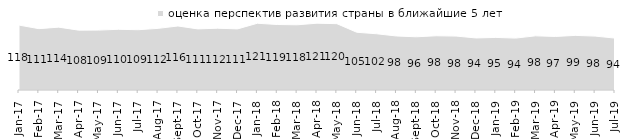
| Category | оценка перспектив развития страны в ближайшие 5 лет |
|---|---|
| 2017-01-01 | 117.55 |
| 2017-02-01 | 111.15 |
| 2017-03-01 | 113.85 |
| 2017-04-01 | 108.45 |
| 2017-05-01 | 108.5 |
| 2017-06-01 | 109.95 |
| 2017-07-01 | 109.2 |
| 2017-08-01 | 111.65 |
| 2017-09-01 | 115.95 |
| 2017-10-01 | 110.7 |
| 2017-11-01 | 111.95 |
| 2017-12-01 | 110.7 |
| 2018-01-01 | 120.9 |
| 2018-02-01 | 118.65 |
| 2018-03-01 | 118.1 |
| 2018-04-01 | 121 |
| 2018-05-01 | 120.15 |
| 2018-06-01 | 104.6 |
| 2018-07-01 | 101.85 |
| 2018-08-01 | 97.85 |
| 2018-09-01 | 96.4 |
| 2018-10-01 | 98.25 |
| 2018-11-01 | 97.705 |
| 2018-12-01 | 94.3 |
| 2019-01-01 | 95.25 |
| 2019-02-01 | 94.05 |
| 2019-03-01 | 98.11 |
| 2019-04-01 | 97.03 |
| 2019-05-01 | 98.91 |
| 2019-06-01 | 97.656 |
| 2019-07-01 | 94.01 |